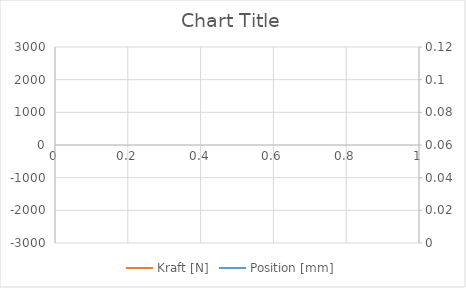
| Category | Kraft [N] |
|---|---|
| 0 | 0 |
| 1 | 2461.446 |
| 2 | 2461.446 |
| 3 | 2461.446 |
| 4 | 2461.446 |
| 5 | 2461.446 |
| 6 | 2461.446 |
| 7 | 2461.446 |
| 8 | 2461.446 |
| 9 | 2461.446 |
| 10 | 2461.446 |
| 11 | 2461.446 |
| 12 | 2461.446 |
| 13 | 2461.446 |
| 14 | 2461.446 |
| 15 | 2461.446 |
| 16 | 2461.446 |
| 17 | 2461.446 |
| 18 | 2461.446 |
| 19 | 2461.446 |
| 20 | 2461.446 |
| 21 | 2461.446 |
| 22 | 2461.446 |
| 23 | 2461.446 |
| 24 | 2461.446 |
| 25 | 2461.446 |
| 26 | 2461.446 |
| 27 | 2461.446 |
| 28 | 2461.446 |
| 29 | 2461.446 |
| 30 | 2461.446 |
| 31 | 2461.446 |
| 32 | 2461.446 |
| 33 | 2461.446 |
| 34 | 2461.446 |
| 35 | 2461.446 |
| 36 | 2461.446 |
| 37 | 2461.446 |
| 38 | 2461.446 |
| 39 | 2461.446 |
| 40 | 2461.446 |
| 41 | 2461.446 |
| 42 | 2461.446 |
| 43 | 2461.446 |
| 44 | 2461.446 |
| 45 | 2461.446 |
| 46 | 2461.446 |
| 47 | 2461.446 |
| 48 | 2461.446 |
| 49 | 2461.446 |
| 50 | 2461.446 |
| 51 | 2461.446 |
| 52 | 2461.446 |
| 53 | 2461.446 |
| 54 | 2461.446 |
| 55 | 2461.446 |
| 56 | 2461.446 |
| 57 | 2461.446 |
| 58 | 2461.446 |
| 59 | 2461.446 |
| 60 | 2461.446 |
| 61 | 2461.446 |
| 62 | 2461.446 |
| 63 | 2461.446 |
| 64 | 2461.446 |
| 65 | 2461.446 |
| 66 | 2461.446 |
| 67 | 2461.446 |
| 68 | 2461.446 |
| 69 | 2461.446 |
| 70 | 2461.446 |
| 71 | 2461.446 |
| 72 | 2461.446 |
| 73 | 2461.446 |
| 74 | 2461.446 |
| 75 | 2461.446 |
| 76 | 2461.446 |
| 77 | 2461.446 |
| 78 | 2461.446 |
| 79 | 2461.446 |
| 80 | 2461.446 |
| 81 | 2461.446 |
| 82 | 2461.446 |
| 83 | 2461.446 |
| 84 | 2461.446 |
| 85 | 2461.446 |
| 86 | 2461.446 |
| 87 | 2461.446 |
| 88 | 2461.446 |
| 89 | 2461.446 |
| 90 | 2461.446 |
| 91 | 2461.446 |
| 92 | 2461.446 |
| 93 | 2461.446 |
| 94 | 2461.446 |
| 95 | 2461.446 |
| 96 | 2461.446 |
| 97 | 2461.446 |
| 98 | 2461.446 |
| 99 | 2461.446 |
| 100 | 2461.446 |
| 101 | 2461.446 |
| 102 | 2461.446 |
| 103 | 2461.446 |
| 104 | 2461.446 |
| 105 | 2461.446 |
| 106 | 2461.446 |
| 107 | 2461.446 |
| 108 | 2461.446 |
| 109 | 2461.446 |
| 110 | 2461.446 |
| 111 | 2461.446 |
| 112 | 2461.446 |
| 113 | 2461.446 |
| 114 | 2461.446 |
| 115 | 2461.446 |
| 116 | 2461.446 |
| 117 | 2461.446 |
| 118 | 2461.446 |
| 119 | 2461.446 |
| 120 | 2461.446 |
| 121 | 2461.446 |
| 122 | 2461.446 |
| 123 | 2461.446 |
| 124 | 2461.446 |
| 125 | 2461.446 |
| 126 | 2461.446 |
| 127 | 2461.446 |
| 128 | 2461.446 |
| 129 | 2461.446 |
| 130 | 2461.446 |
| 131 | 2461.446 |
| 132 | 2461.446 |
| 133 | 2461.446 |
| 134 | 2461.446 |
| 135 | 2461.446 |
| 136 | 2461.446 |
| 137 | 2461.446 |
| 138 | 2461.446 |
| 139 | 2461.446 |
| 140 | 2461.446 |
| 141 | 2461.446 |
| 142 | 2461.446 |
| 143 | 2461.446 |
| 144 | 2461.446 |
| 145 | 2461.446 |
| 146 | 2461.446 |
| 147 | 2461.446 |
| 148 | 2461.446 |
| 149 | 2461.446 |
| 150 | 2461.446 |
| 151 | 2461.446 |
| 152 | 2461.446 |
| 153 | 2461.446 |
| 154 | 2461.446 |
| 155 | 2461.446 |
| 156 | 2461.446 |
| 157 | 2461.446 |
| 158 | 2461.446 |
| 159 | 2461.446 |
| 160 | 2461.446 |
| 161 | 2461.446 |
| 162 | 2461.446 |
| 163 | 2461.446 |
| 164 | 2461.446 |
| 165 | 2461.446 |
| 166 | 2461.446 |
| 167 | 2461.446 |
| 168 | 2461.446 |
| 169 | 2461.446 |
| 170 | 2461.446 |
| 171 | 2461.446 |
| 172 | 2461.446 |
| 173 | 2461.446 |
| 174 | 2461.446 |
| 175 | 2461.446 |
| 176 | 2461.446 |
| 177 | 2461.446 |
| 178 | 2461.446 |
| 179 | 2461.446 |
| 180 | 2461.446 |
| 181 | 2461.446 |
| 182 | 2461.446 |
| 183 | 2461.446 |
| 184 | 2461.446 |
| 185 | 2461.446 |
| 186 | 2461.446 |
| 187 | 2461.446 |
| 188 | 2461.446 |
| 189 | 2461.446 |
| 190 | 2461.446 |
| 191 | 170.046 |
| 192 | 170.046 |
| 193 | 170.046 |
| 194 | 170.046 |
| 195 | 170.046 |
| 196 | 170.046 |
| 197 | 170.046 |
| 198 | 170.046 |
| 199 | 170.046 |
| 200 | 170.046 |
| 201 | 170.046 |
| 202 | 170.046 |
| 203 | 170.046 |
| 204 | 170.046 |
| 205 | 170.046 |
| 206 | 170.046 |
| 207 | 170.046 |
| 208 | 170.046 |
| 209 | 170.046 |
| 210 | 170.046 |
| 211 | 170.046 |
| 212 | 170.046 |
| 213 | 170.046 |
| 214 | 170.046 |
| 215 | 170.046 |
| 216 | 170.046 |
| 217 | 170.046 |
| 218 | 170.046 |
| 219 | 170.046 |
| 220 | 170.046 |
| 221 | 170.046 |
| 222 | 170.046 |
| 223 | 170.046 |
| 224 | 170.046 |
| 225 | 170.046 |
| 226 | 170.046 |
| 227 | 170.046 |
| 228 | 170.046 |
| 229 | 170.046 |
| 230 | 170.046 |
| 231 | 170.046 |
| 232 | 170.046 |
| 233 | 170.046 |
| 234 | 170.046 |
| 235 | 170.046 |
| 236 | 170.046 |
| 237 | 170.046 |
| 238 | 170.046 |
| 239 | -2121.354 |
| 240 | -2121.354 |
| 241 | -2121.354 |
| 242 | -2121.354 |
| 243 | -2121.354 |
| 244 | -2121.354 |
| 245 | -2121.354 |
| 246 | -2121.354 |
| 247 | -2121.354 |
| 248 | -2121.354 |
| 249 | -2121.354 |
| 250 | -2121.354 |
| 251 | -2121.354 |
| 252 | -2121.354 |
| 253 | -2121.354 |
| 254 | -2121.354 |
| 255 | -2121.354 |
| 256 | -2121.354 |
| 257 | -2121.354 |
| 258 | -2121.354 |
| 259 | -2121.354 |
| 260 | -2121.354 |
| 261 | -2121.354 |
| 262 | -2121.354 |
| 263 | -2121.354 |
| 264 | -2121.354 |
| 265 | -2121.354 |
| 266 | -2121.354 |
| 267 | -2121.354 |
| 268 | -2121.354 |
| 269 | -2121.354 |
| 270 | -2121.354 |
| 271 | -2121.354 |
| 272 | -2121.354 |
| 273 | -2121.354 |
| 274 | -2121.354 |
| 275 | -2121.354 |
| 276 | -2121.354 |
| 277 | -2121.354 |
| 278 | -2121.354 |
| 279 | -2121.354 |
| 280 | -2121.354 |
| 281 | -2121.354 |
| 282 | -2121.354 |
| 283 | -2121.354 |
| 284 | -2121.354 |
| 285 | -2121.354 |
| 286 | -2121.354 |
| 287 | -2121.354 |
| 288 | -2121.354 |
| 289 | -2121.354 |
| 290 | -2121.354 |
| 291 | -2121.354 |
| 292 | -2121.354 |
| 293 | -2121.354 |
| 294 | -2121.354 |
| 295 | -2121.354 |
| 296 | -2121.354 |
| 297 | -2121.354 |
| 298 | -2121.354 |
| 299 | -2121.354 |
| 300 | -2121.354 |
| 301 | -2121.354 |
| 302 | -2121.354 |
| 303 | -2121.354 |
| 304 | -2121.354 |
| 305 | -2121.354 |
| 306 | -2121.354 |
| 307 | -2121.354 |
| 308 | -2121.354 |
| 309 | -2121.354 |
| 310 | -2121.354 |
| 311 | -2121.354 |
| 312 | -2121.354 |
| 313 | -2121.354 |
| 314 | -2121.354 |
| 315 | -2121.354 |
| 316 | -2121.354 |
| 317 | -2121.354 |
| 318 | -2121.354 |
| 319 | -2121.354 |
| 320 | -2121.354 |
| 321 | -2121.354 |
| 322 | -2121.354 |
| 323 | -2121.354 |
| 324 | -2121.354 |
| 325 | -2121.354 |
| 326 | -2121.354 |
| 327 | -2121.354 |
| 328 | -2121.354 |
| 329 | -2121.354 |
| 330 | -2121.354 |
| 331 | -2121.354 |
| 332 | -2121.354 |
| 333 | -2121.354 |
| 334 | -2121.354 |
| 335 | -2121.354 |
| 336 | -2121.354 |
| 337 | -2121.354 |
| 338 | -2121.354 |
| 339 | -2121.354 |
| 340 | -2121.354 |
| 341 | -2121.354 |
| 342 | -2121.354 |
| 343 | -2121.354 |
| 344 | -2121.354 |
| 345 | -2121.354 |
| 346 | -2121.354 |
| 347 | -2121.354 |
| 348 | -2121.354 |
| 349 | -2121.354 |
| 350 | -2121.354 |
| 351 | -2121.354 |
| 352 | -2121.354 |
| 353 | -2121.354 |
| 354 | -2121.354 |
| 355 | -2121.354 |
| 356 | -2121.354 |
| 357 | -2121.354 |
| 358 | -2121.354 |
| 359 | -2121.354 |
| 360 | -2121.354 |
| 361 | -2121.354 |
| 362 | -2121.354 |
| 363 | -2121.354 |
| 364 | -2121.354 |
| 365 | -2121.354 |
| 366 | -2121.354 |
| 367 | -2121.354 |
| 368 | -2121.354 |
| 369 | -2121.354 |
| 370 | -2121.354 |
| 371 | -2121.354 |
| 372 | -2121.354 |
| 373 | -2121.354 |
| 374 | -2121.354 |
| 375 | -2121.354 |
| 376 | -2121.354 |
| 377 | -2121.354 |
| 378 | -2121.354 |
| 379 | -2121.354 |
| 380 | -2121.354 |
| 381 | -2121.354 |
| 382 | -2121.354 |
| 383 | -2121.354 |
| 384 | -2121.354 |
| 385 | -2121.354 |
| 386 | -2121.354 |
| 387 | -2121.354 |
| 388 | -2121.354 |
| 389 | -2121.354 |
| 390 | -2121.354 |
| 391 | -2121.354 |
| 392 | -2121.354 |
| 393 | -2121.354 |
| 394 | -2121.354 |
| 395 | -2121.354 |
| 396 | -2121.354 |
| 397 | -2121.354 |
| 398 | -2121.354 |
| 399 | -2121.354 |
| 400 | -2121.354 |
| 401 | -2121.354 |
| 402 | -2121.354 |
| 403 | -2121.354 |
| 404 | -2121.354 |
| 405 | -2121.354 |
| 406 | -2121.354 |
| 407 | -2121.354 |
| 408 | -2121.354 |
| 409 | -2121.354 |
| 410 | -2121.354 |
| 411 | -2121.354 |
| 412 | -2121.354 |
| 413 | -2121.354 |
| 414 | -2121.354 |
| 415 | -2121.354 |
| 416 | -2121.354 |
| 417 | -2121.354 |
| 418 | -2121.354 |
| 419 | -2121.354 |
| 420 | -2121.354 |
| 421 | -2121.354 |
| 422 | -2121.354 |
| 423 | -2121.354 |
| 424 | -2121.354 |
| 425 | -2121.354 |
| 426 | -2121.354 |
| 427 | -2121.354 |
| 428 | -2121.354 |
| 429 | 0 |
| 430 | 0 |
| 431 | 0 |
| 432 | 0 |
| 433 | 0 |
| 434 | 0 |
| 435 | 0 |
| 436 | 0 |
| 437 | 0 |
| 438 | 0 |
| 439 | 0 |
| 440 | 0 |
| 441 | 0 |
| 442 | 0 |
| 443 | 0 |
| 444 | 0 |
| 445 | 0 |
| 446 | 0 |
| 447 | 0 |
| 448 | 0 |
| 449 | 0 |
| 450 | 0 |
| 451 | 0 |
| 452 | 0 |
| 453 | 0 |
| 454 | 0 |
| 455 | 0 |
| 456 | 0 |
| 457 | 0 |
| 458 | 0 |
| 459 | 0 |
| 460 | 0 |
| 461 | 0 |
| 462 | 0 |
| 463 | 0 |
| 464 | 0 |
| 465 | 0 |
| 466 | 0 |
| 467 | 0 |
| 468 | 0 |
| 469 | 0 |
| 470 | 0 |
| 471 | 0 |
| 472 | 0 |
| 473 | 0 |
| 474 | 0 |
| 475 | 0 |
| 476 | 0 |
| 477 | 0 |
| 478 | 0 |
| 479 | 0 |
| 480 | 0 |
| 481 | 0 |
| 482 | 0 |
| 483 | 0 |
| 484 | 0 |
| 485 | 0 |
| 486 | 0 |
| 487 | 0 |
| 488 | 0 |
| 489 | 0 |
| 490 | 0 |
| 491 | 0 |
| 492 | 0 |
| 493 | 0 |
| 494 | 0 |
| 495 | 0 |
| 496 | 0 |
| 497 | 0 |
| 498 | 0 |
| 499 | 0 |
| 500 | 0 |
| 501 | 0 |
| 502 | 0 |
| 503 | 0 |
| 504 | 0 |
| 505 | 0 |
| 506 | 0 |
| 507 | 0 |
| 508 | 0 |
| 509 | 0 |
| 510 | 0 |
| 511 | 0 |
| 512 | 0 |
| 513 | 0 |
| 514 | 0 |
| 515 | 0 |
| 516 | 0 |
| 517 | 0 |
| 518 | 0 |
| 519 | 0 |
| 520 | 0 |
| 521 | 0 |
| 522 | 0 |
| 523 | 0 |
| 524 | 0 |
| 525 | 0 |
| 526 | 0 |
| 527 | 0 |
| 528 | 0 |
| 529 | 0 |
| 530 | 0 |
| 531 | 0 |
| 532 | 0 |
| 533 | 0 |
| 534 | 0 |
| 535 | 0 |
| 536 | 0 |
| 537 | 0 |
| 538 | 0 |
| 539 | 0 |
| 540 | 0 |
| 541 | 0 |
| 542 | 0 |
| 543 | 0 |
| 544 | 0 |
| 545 | 0 |
| 546 | 0 |
| 547 | 0 |
| 548 | 0 |
| 549 | 0 |
| 550 | 0 |
| 551 | 0 |
| 552 | 0 |
| 553 | 0 |
| 554 | 0 |
| 555 | 0 |
| 556 | 0 |
| 557 | 0 |
| 558 | 0 |
| 559 | 0 |
| 560 | 0 |
| 561 | 0 |
| 562 | 0 |
| 563 | 0 |
| 564 | 0 |
| 565 | 0 |
| 566 | 0 |
| 567 | 0 |
| 568 | 0 |
| 569 | 0 |
| 570 | 0 |
| 571 | 0 |
| 572 | 0 |
| 573 | 0 |
| 574 | 0 |
| 575 | 0 |
| 576 | 0 |
| 577 | 0 |
| 578 | 0 |
| 579 | 0 |
| 580 | 0 |
| 581 | 0 |
| 582 | 0 |
| 583 | 0 |
| 584 | 0 |
| 585 | 0 |
| 586 | 0 |
| 587 | 0 |
| 588 | 0 |
| 589 | 0 |
| 590 | 0 |
| 591 | 0 |
| 592 | 0 |
| 593 | 0 |
| 594 | 0 |
| 595 | 0 |
| 596 | 0 |
| 597 | 0 |
| 598 | 0 |
| 599 | 0 |
| 600 | 0 |
| 601 | 0 |
| 602 | 0 |
| 603 | 0 |
| 604 | 0 |
| 605 | 0 |
| 606 | 0 |
| 607 | 0 |
| 608 | 0 |
| 609 | 0 |
| 610 | 0 |
| 611 | 0 |
| 612 | 0 |
| 613 | 0 |
| 614 | 0 |
| 615 | 0 |
| 616 | 0 |
| 617 | 0 |
| 618 | 0 |
| 619 | 0 |
| 620 | 0 |
| 621 | 0 |
| 622 | 0 |
| 623 | 0 |
| 624 | 0 |
| 625 | 0 |
| 626 | 0 |
| 627 | 0 |
| 628 | 0 |
| 629 | 0 |
| 630 | 0 |
| 631 | 0 |
| 632 | 0 |
| 633 | 0 |
| 634 | 0 |
| 635 | 0 |
| 636 | 0 |
| 637 | 0 |
| 638 | 0 |
| 639 | 0 |
| 640 | 0 |
| 641 | 0 |
| 642 | 0 |
| 643 | 0 |
| 644 | 0 |
| 645 | 0 |
| 646 | 0 |
| 647 | 0 |
| 648 | 0 |
| 649 | 0 |
| 650 | 0 |
| 651 | 0 |
| 652 | 0 |
| 653 | 0 |
| 654 | 0 |
| 655 | 0 |
| 656 | 0 |
| 657 | 0 |
| 658 | 0 |
| 659 | 0 |
| 660 | 0 |
| 661 | 0 |
| 662 | 0 |
| 663 | 0 |
| 664 | 0 |
| 665 | 0 |
| 666 | 0 |
| 667 | 0 |
| 668 | 0 |
| 669 | 0 |
| 670 | 0 |
| 671 | 0 |
| 672 | 0 |
| 673 | 0 |
| 674 | 0 |
| 675 | 0 |
| 676 | 0 |
| 677 | 0 |
| 678 | 0 |
| 679 | 0 |
| 680 | 0 |
| 681 | 0 |
| 682 | 0 |
| 683 | 0 |
| 684 | 0 |
| 685 | 0 |
| 686 | 0 |
| 687 | 0 |
| 688 | 0 |
| 689 | 0 |
| 690 | 0 |
| 691 | 0 |
| 692 | 0 |
| 693 | 0 |
| 694 | 0 |
| 695 | 0 |
| 696 | 0 |
| 697 | 0 |
| 698 | 0 |
| 699 | 0 |
| 700 | 0 |
| 701 | 0 |
| 702 | 0 |
| 703 | 0 |
| 704 | 0 |
| 705 | 0 |
| 706 | 0 |
| 707 | 0 |
| 708 | 0 |
| 709 | 0 |
| 710 | 0 |
| 711 | 0 |
| 712 | 0 |
| 713 | 0 |
| 714 | 0 |
| 715 | 0 |
| 716 | 0 |
| 717 | 0 |
| 718 | 0 |
| 719 | 0 |
| 720 | 0 |
| 721 | 0 |
| 722 | 0 |
| 723 | 0 |
| 724 | 0 |
| 725 | 0 |
| 726 | 0 |
| 727 | 0 |
| 728 | 0 |
| 729 | 0 |
| 730 | 0 |
| 731 | 0 |
| 732 | 0 |
| 733 | 0 |
| 734 | 0 |
| 735 | 0 |
| 736 | 0 |
| 737 | 0 |
| 738 | 0 |
| 739 | 0 |
| 740 | 0 |
| 741 | 0 |
| 742 | 0 |
| 743 | 0 |
| 744 | 0 |
| 745 | 0 |
| 746 | 0 |
| 747 | 0 |
| 748 | 0 |
| 749 | 0 |
| 750 | 0 |
| 751 | 0 |
| 752 | 0 |
| 753 | 0 |
| 754 | 0 |
| 755 | 0 |
| 756 | 0 |
| 757 | 0 |
| 758 | 0 |
| 759 | 0 |
| 760 | 0 |
| 761 | 0 |
| 762 | 0 |
| 763 | 0 |
| 764 | 0 |
| 765 | 0 |
| 766 | 0 |
| 767 | 0 |
| 768 | 0 |
| 769 | 0 |
| 770 | 0 |
| 771 | 0 |
| 772 | 0 |
| 773 | 0 |
| 774 | 0 |
| 775 | 0 |
| 776 | 0 |
| 777 | 0 |
| 778 | 0 |
| 779 | 0 |
| 780 | 0 |
| 781 | 0 |
| 782 | 0 |
| 783 | 0 |
| 784 | 0 |
| 785 | 0 |
| 786 | 0 |
| 787 | 0 |
| 788 | 0 |
| 789 | 0 |
| 790 | 0 |
| 791 | 0 |
| 792 | 0 |
| 793 | 0 |
| 794 | 0 |
| 795 | 0 |
| 796 | 0 |
| 797 | 0 |
| 798 | 0 |
| 799 | 0 |
| 800 | 0 |
| 801 | 0 |
| 802 | 0 |
| 803 | 0 |
| 804 | 0 |
| 805 | 0 |
| 806 | 0 |
| 807 | 0 |
| 808 | 0 |
| 809 | 0 |
| 810 | 0 |
| 811 | 0 |
| 812 | 0 |
| 813 | 0 |
| 814 | 0 |
| 815 | 0 |
| 816 | 0 |
| 817 | 0 |
| 818 | 0 |
| 819 | 0 |
| 820 | 0 |
| 821 | 0 |
| 822 | 0 |
| 823 | 0 |
| 824 | 0 |
| 825 | 0 |
| 826 | 0 |
| 827 | 0 |
| 828 | 0 |
| 829 | 0 |
| 830 | 0 |
| 831 | 0 |
| 832 | 0 |
| 833 | 0 |
| 834 | 0 |
| 835 | 0 |
| 836 | 0 |
| 837 | 0 |
| 838 | 0 |
| 839 | 0 |
| 840 | 0 |
| 841 | 0 |
| 842 | 0 |
| 843 | 0 |
| 844 | 0 |
| 845 | 0 |
| 846 | 0 |
| 847 | 0 |
| 848 | 0 |
| 849 | 0 |
| 850 | 0 |
| 851 | 0 |
| 852 | 0 |
| 853 | 0 |
| 854 | 0 |
| 855 | 0 |
| 856 | 0 |
| 857 | 0 |
| 858 | 0 |
| 859 | 0 |
| 860 | 0 |
| 861 | 0 |
| 862 | 0 |
| 863 | 0 |
| 864 | 0 |
| 865 | 0 |
| 866 | 0 |
| 867 | 0 |
| 868 | 0 |
| 869 | 0 |
| 870 | 0 |
| 871 | 0 |
| 872 | 0 |
| 873 | 0 |
| 874 | 0 |
| 875 | 0 |
| 876 | 0 |
| 877 | 0 |
| 878 | 0 |
| 879 | 0 |
| 880 | 0 |
| 881 | 0 |
| 882 | 0 |
| 883 | 0 |
| 884 | 0 |
| 885 | 0 |
| 886 | 0 |
| 887 | 0 |
| 888 | 0 |
| 889 | 0 |
| 890 | 0 |
| 891 | 0 |
| 892 | 0 |
| 893 | 0 |
| 894 | 0 |
| 895 | 0 |
| 896 | 0 |
| 897 | 0 |
| 898 | 0 |
| 899 | 0 |
| 900 | 0 |
| 901 | 0 |
| 902 | 0 |
| 903 | 0 |
| 904 | 0 |
| 905 | 0 |
| 906 | 0 |
| 907 | 0 |
| 908 | 0 |
| 909 | 0 |
| 910 | 0 |
| 911 | 0 |
| 912 | 0 |
| 913 | 0 |
| 914 | 0 |
| 915 | 0 |
| 916 | 0 |
| 917 | 0 |
| 918 | 0 |
| 919 | 0 |
| 920 | 0 |
| 921 | 0 |
| 922 | 0 |
| 923 | 0 |
| 924 | 0 |
| 925 | 0 |
| 926 | 0 |
| 927 | 0 |
| 928 | 0 |
| 929 | 0 |
| 930 | 0 |
| 931 | 0 |
| 932 | 0 |
| 933 | 0 |
| 934 | 0 |
| 935 | 0 |
| 936 | 0 |
| 937 | 0 |
| 938 | 0 |
| 939 | 0 |
| 940 | 0 |
| 941 | 0 |
| 942 | 0 |
| 943 | 0 |
| 944 | 0 |
| 945 | 0 |
| 946 | 0 |
| 947 | 0 |
| 948 | 0 |
| 949 | 0 |
| 950 | 0 |
| 951 | 0 |
| 952 | 0 |
| 953 | 0 |
| 954 | 0 |
| 955 | 0 |
| 956 | 0 |
| 957 | 0 |
| 958 | 0 |
| 959 | 0 |
| 960 | 0 |
| 961 | 0 |
| 962 | 0 |
| 963 | 0 |
| 964 | 0 |
| 965 | 0 |
| 966 | 0 |
| 967 | 0 |
| 968 | 0 |
| 969 | 0 |
| 970 | 0 |
| 971 | 0 |
| 972 | 0 |
| 973 | 0 |
| 974 | 0 |
| 975 | 0 |
| 976 | 0 |
| 977 | 0 |
| 978 | 0 |
| 979 | 0 |
| 980 | 0 |
| 981 | 0 |
| 982 | 0 |
| 983 | 0 |
| 984 | 0 |
| 985 | 0 |
| 986 | 0 |
| 987 | 0 |
| 988 | 0 |
| 989 | 0 |
| 990 | 0 |
| 991 | 0 |
| 992 | 0 |
| 993 | 0 |
| 994 | 0 |
| 995 | 0 |
| 996 | 0 |
| 997 | 0 |
| 998 | 0 |
| 999 | 0 |
| 1000 | 0 |